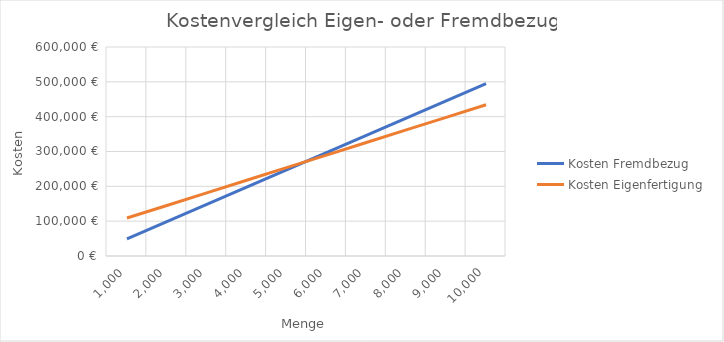
| Category | Kosten Fremdbezug | Kosten Eigenfertigung |
|---|---|---|
| 1000.0 | 49500 | 108950 |
| 2000.0 | 99000 | 145100 |
| 3000.0 | 148500 | 181250 |
| 4000.0 | 198000 | 217400 |
| 5000.0 | 247500 | 253550 |
| 6000.0 | 297000 | 289700 |
| 7000.0 | 346500 | 325850 |
| 8000.0 | 396000 | 362000 |
| 9000.0 | 445500 | 398150 |
| 10000.0 | 495000 | 434300 |